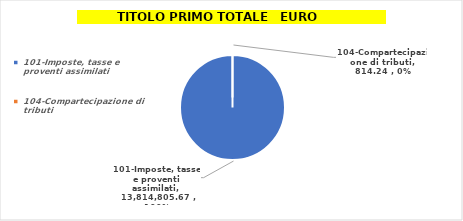
| Category | Series 0 |
|---|---|
| 101-Imposte, tasse e proventi assimilati | 13814805.67 |
| 104-Compartecipazione di tributi | 814.24 |